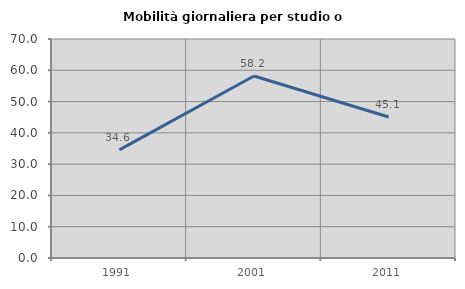
| Category | Mobilità giornaliera per studio o lavoro |
|---|---|
| 1991.0 | 34.561 |
| 2001.0 | 58.17 |
| 2011.0 | 45.054 |